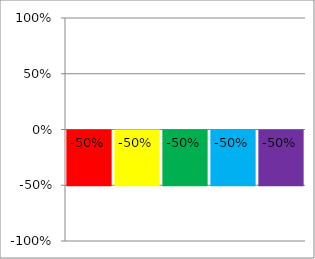
| Category | Series 0 |
|---|---|
| 0 | -0.5 |
| 1 | -0.5 |
| 2 | -0.5 |
| 3 | -0.5 |
| 4 | -0.5 |